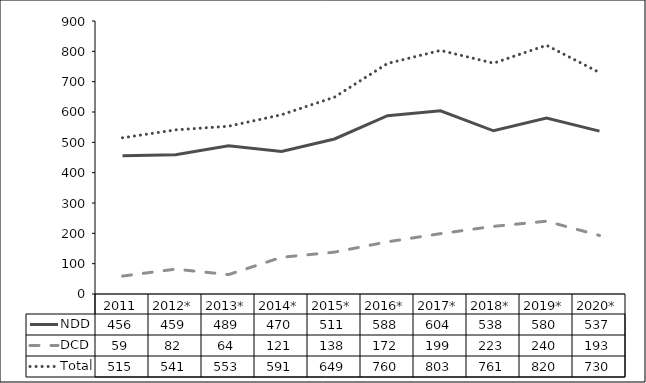
| Category | NDD | DCD | Total |
|---|---|---|---|
| 2011 | 456 | 59 | 515 |
| 2012* | 459 | 82 | 541 |
| 2013* | 489 | 64 | 553 |
| 2014* | 470 | 121 | 591 |
| 2015* | 511 | 138 | 649 |
| 2016* | 588 | 172 | 760 |
| 2017* | 604 | 199 | 803 |
| 2018* | 538 | 223 | 761 |
| 2019* | 580 | 240 | 820 |
| 2020* | 537 | 193 | 730 |